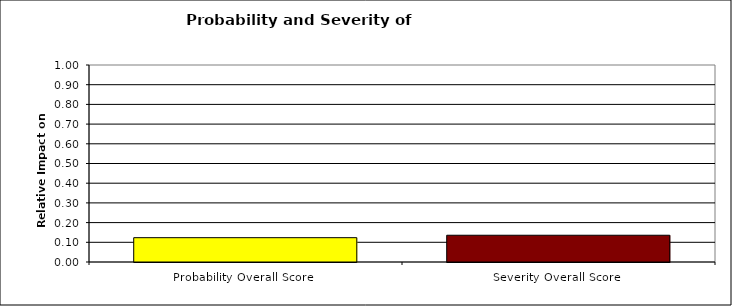
| Category | Series 0 |
|---|---|
| Probability Overall Score | 0.123 |
| Severity Overall Score | 0.136 |